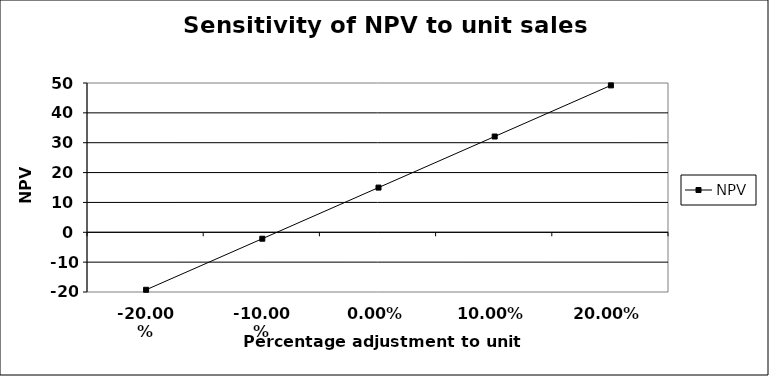
| Category | NPV |
|---|---|
| -0.2 | -19.26 |
| -0.1 | -2.15 |
| 0.0 | 14.97 |
| 0.1 | 32.08 |
| 0.2 | 49.2 |